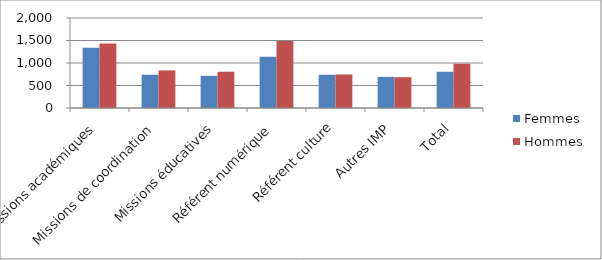
| Category | Femmes | Hommes |
|---|---|---|
| Missions académiques | 1339 | 1435 |
| Missions de coordination | 739 | 835 |
| Missions éducatives | 715 | 806 |
| Référent numérique | 1141 | 1488 |
| Référent culture | 739 | 745 |
| Autres IMP | 692 | 684 |
| Total | 806 | 984 |